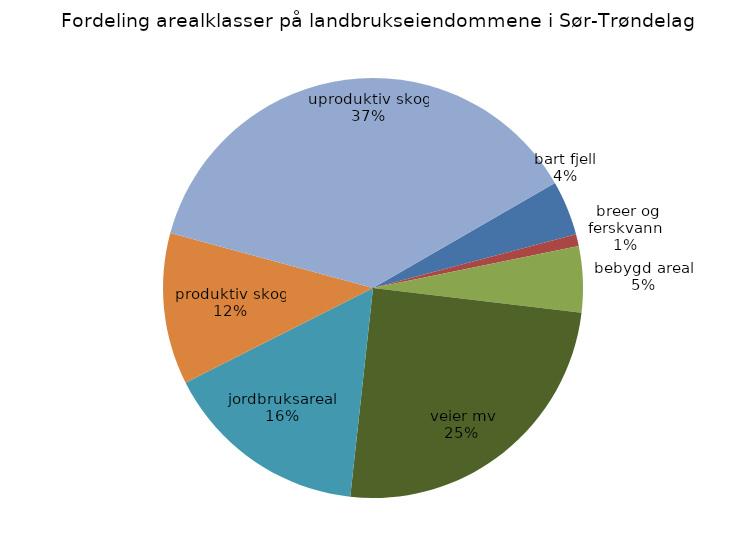
| Category | Totalt |
|---|---|
| bart fjell, breer og ferskvann | 669000 |
| bebygd areal, veier mv | 145100 |
| jordbruksareal | 805300 |
| produktiv skog | 3943500 |
| uproduktiv skog | 2510600 |
| våtmark | 1849900 |
| åpen fastmark | 5942800 |